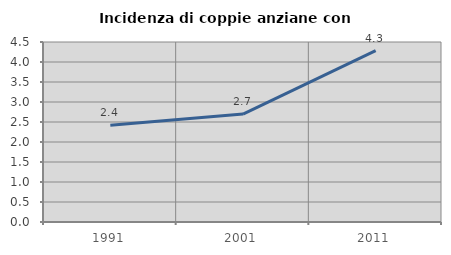
| Category | Incidenza di coppie anziane con figli |
|---|---|
| 1991.0 | 2.416 |
| 2001.0 | 2.699 |
| 2011.0 | 4.284 |